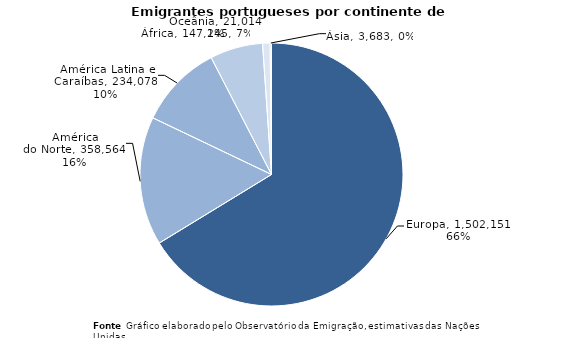
| Category | Series 0 |
|---|---|
| Europa | 1502151 |
| América
do Norte | 358564 |
| América Latina e Caraíbas | 234078 |
| África | 147245 |
| Oceânia | 21014 |
| Ásia | 3683 |